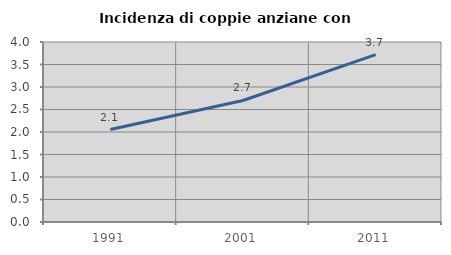
| Category | Incidenza di coppie anziane con figli |
|---|---|
| 1991.0 | 2.054 |
| 2001.0 | 2.701 |
| 2011.0 | 3.72 |